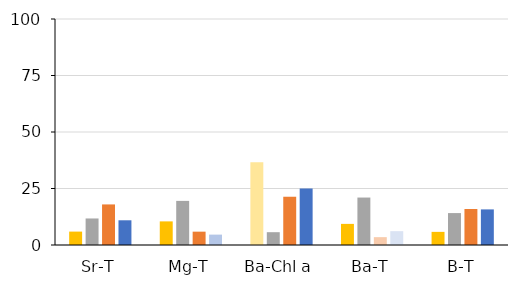
| Category | FO | IOM | ICE | GOM |
|---|---|---|---|---|
| Sr-T | 5.929 | 11.741 | 17.953 | 10.938 |
| Mg-T | 10.448 | 19.517 | 5.902 | 4.596 |
| Ba-Chl a | 36.624 | 5.671 | 21.352 | 25.001 |
| Ba-T | 9.343 | 20.995 | 3.472 | 6.122 |
| B-T | 5.81 | 14.125 | 15.923 | 15.75 |